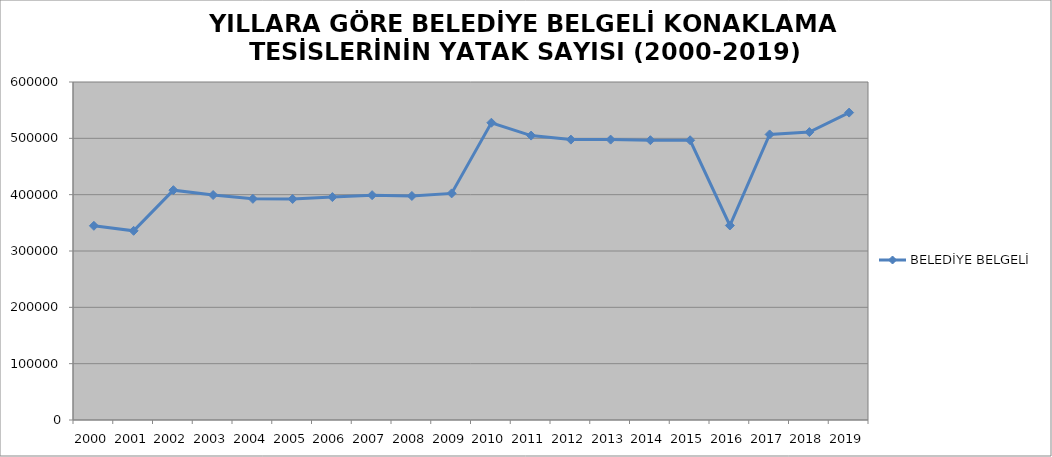
| Category | BELEDİYE BELGELİ |
|---|---|
| 2000 | 344736 |
| 2001 | 335825 |
| 2002 | 408005 |
| 2003 | 399369 |
| 2004 | 392582 |
| 2005 | 392338 |
| 2006 | 395671 |
| 2007 | 399110 |
| 2008 | 397684 |
| 2009 | 402289 |
| 2010 | 527712 |
| 2011 | 504877 |
| 2012 | 497728 |
| 2013 | 497728 |
| 2014 | 496697 |
| 2015 | 496574 |
| 2016 | 345267 |
| 2017 | 506934 |
| 2018 | 511076 |
| 2019 | 545669 |